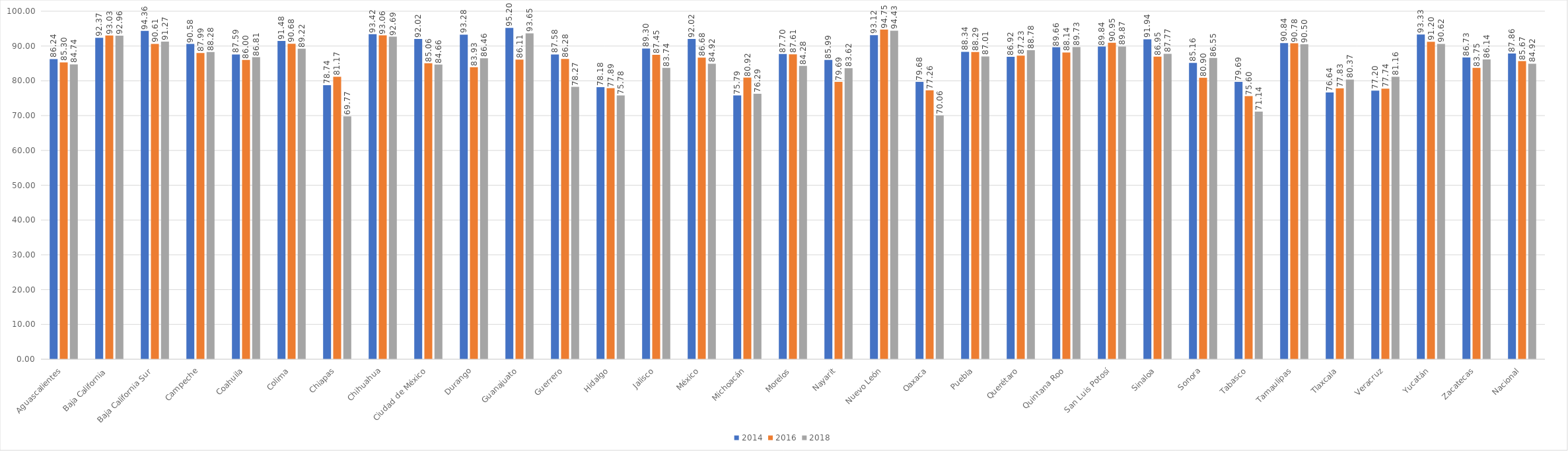
| Category | 2014 | 2016 | 2018 |
|---|---|---|---|
| Aguascalientes | 86.245 | 85.297 | 84.744 |
| Baja California | 92.373 | 93.035 | 92.959 |
| Baja California Sur | 94.356 | 90.61 | 91.269 |
| Campeche | 90.585 | 87.992 | 88.284 |
| Coahuila | 87.595 | 86.001 | 86.809 |
| Colima | 91.475 | 90.676 | 89.217 |
| Chiapas | 78.738 | 81.17 | 69.77 |
| Chihuahua | 93.425 | 93.064 | 92.692 |
| Ciudad de México | 92.023 | 85.055 | 84.658 |
| Durango | 93.285 | 83.93 | 86.459 |
| Guanajuato | 95.2 | 86.11 | 93.647 |
| Guerrero | 87.579 | 86.28 | 78.266 |
| Hidalgo | 78.183 | 77.893 | 75.783 |
| Jalisco | 89.298 | 87.453 | 83.737 |
| México | 92.017 | 86.681 | 84.917 |
| Michoacán | 75.789 | 80.922 | 76.291 |
| Morelos | 87.701 | 87.613 | 84.276 |
| Nayarit | 85.987 | 79.694 | 83.622 |
| Nuevo León | 93.123 | 94.753 | 94.425 |
| Oaxaca | 79.681 | 77.26 | 70.062 |
| Puebla | 88.342 | 88.29 | 87.005 |
| Querétaro | 86.922 | 87.233 | 88.782 |
| Quintana Roo | 89.655 | 88.143 | 89.729 |
| San Luis Potosí | 89.842 | 90.951 | 89.871 |
| Sinaloa | 91.939 | 86.95 | 87.774 |
| Sonora | 85.16 | 80.898 | 86.553 |
| Tabasco | 79.687 | 75.596 | 71.145 |
| Tamaulipas | 90.836 | 90.784 | 90.499 |
| Tlaxcala | 76.639 | 77.831 | 80.374 |
| Veracruz | 77.197 | 77.743 | 81.157 |
| Yucatán | 93.331 | 91.202 | 90.619 |
| Zacatecas | 86.728 | 83.748 | 86.142 |
| Nacional | 87.863 | 85.671 | 84.92 |